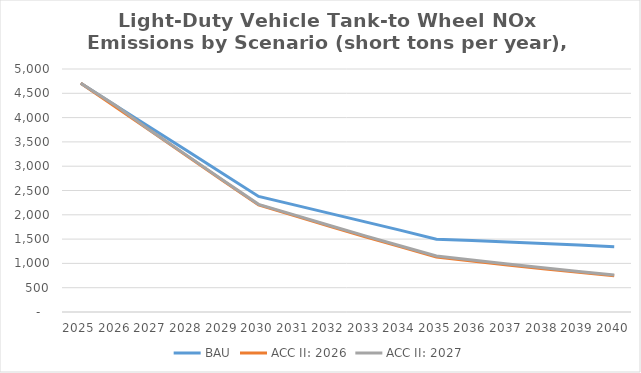
| Category | BAU | ACC II: 2026 | ACC II: 2027 |
|---|---|---|---|
| 2025.0 | 4704.772 | 4704.772 | 4704.772 |
| 2026.0 | 4239.459 | 4208.812 | 4239.459 |
| 2027.0 | 3775.79 | 3706.788 | 3711.788 |
| 2028.0 | 3311.321 | 3205.027 | 3212.502 |
| 2029.0 | 2845.62 | 2701.518 | 2711.341 |
| 2030.0 | 2377.696 | 2203.797 | 2215.221 |
| 2031.0 | 2203.997 | 1983.301 | 1997.181 |
| 2032.0 | 2029.463 | 1763.523 | 1779.447 |
| 2033.0 | 1854.418 | 1548.265 | 1565.601 |
| 2034.0 | 1678.879 | 1338.963 | 1357.039 |
| 2035.0 | 1497.084 | 1133.478 | 1151.509 |
| 2036.0 | 1468.679 | 1050.068 | 1069.289 |
| 2037.0 | 1439.179 | 969.181 | 989.023 |
| 2038.0 | 1408.431 | 890.927 | 910.877 |
| 2039.0 | 1376.742 | 815.729 | 835.085 |
| 2040.0 | 1343.478 | 745.432 | 763.447 |